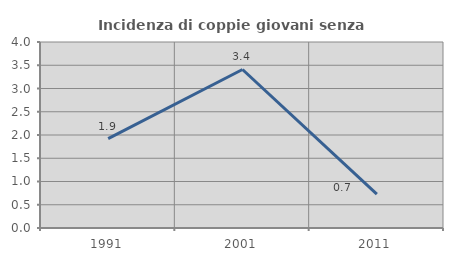
| Category | Incidenza di coppie giovani senza figli |
|---|---|
| 1991.0 | 1.923 |
| 2001.0 | 3.409 |
| 2011.0 | 0.73 |